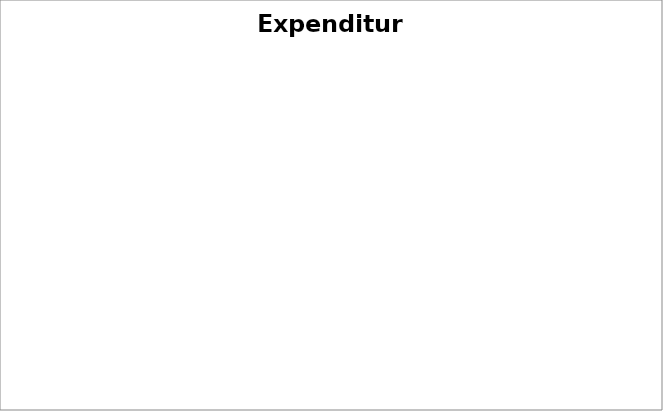
| Category | Series 0 |
|---|---|
| Events Expenditure | 0 |
| Bank Charges | 0 |
| Administrative Cost | 0 |
| Purchases | 0 |
| Misc Expense | 0 |